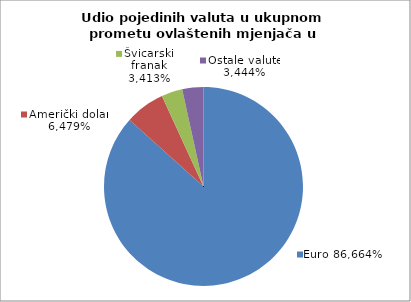
| Category | EUR |
|---|---|
| 0 | 0.867 |
| 1 | 0.065 |
| 2 | 0.034 |
| 3 | 0.034 |